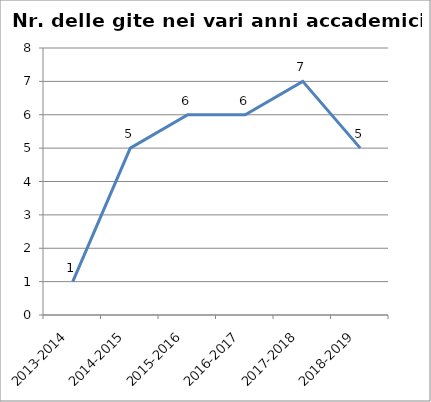
| Category | Nr. Gite Svolte |
|---|---|
| 2013-2014 | 1 |
| 2014-2015 | 5 |
| 2015-2016 | 6 |
| 2016-2017 | 6 |
| 2017-2018 | 7 |
| 2018-2019 | 5 |